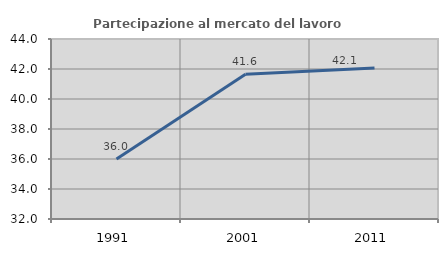
| Category | Partecipazione al mercato del lavoro  femminile |
|---|---|
| 1991.0 | 35.997 |
| 2001.0 | 41.645 |
| 2011.0 | 42.073 |